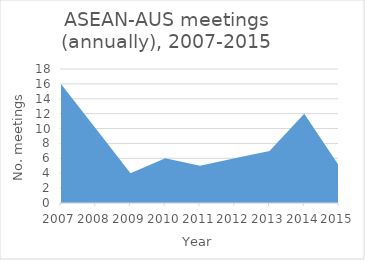
| Category | Number of meetings |
|---|---|
| 2007.0 | 16 |
| 2008.0 | 10 |
| 2009.0 | 4 |
| 2010.0 | 6 |
| 2011.0 | 5 |
| 2012.0 | 6 |
| 2013.0 | 7 |
| 2014.0 | 12 |
| 2015.0 | 5 |